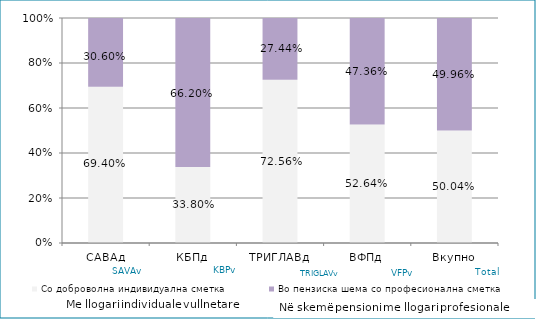
| Category | Со доброволна индивидуална сметка  | Во пензиска шема со професионална сметка |
|---|---|---|
| САВАд | 0.694 | 0.306 |
| КБПд | 0.338 | 0.662 |
| ТРИГЛАВд | 0.726 | 0.274 |
| ВФПд | 0.526 | 0.474 |
| Вкупно | 0.5 | 0.5 |